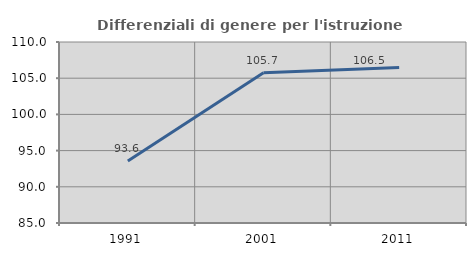
| Category | Differenziali di genere per l'istruzione superiore |
|---|---|
| 1991.0 | 93.579 |
| 2001.0 | 105.75 |
| 2011.0 | 106.479 |